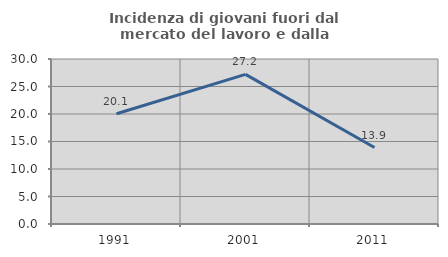
| Category | Incidenza di giovani fuori dal mercato del lavoro e dalla formazione  |
|---|---|
| 1991.0 | 20.052 |
| 2001.0 | 27.204 |
| 2011.0 | 13.898 |